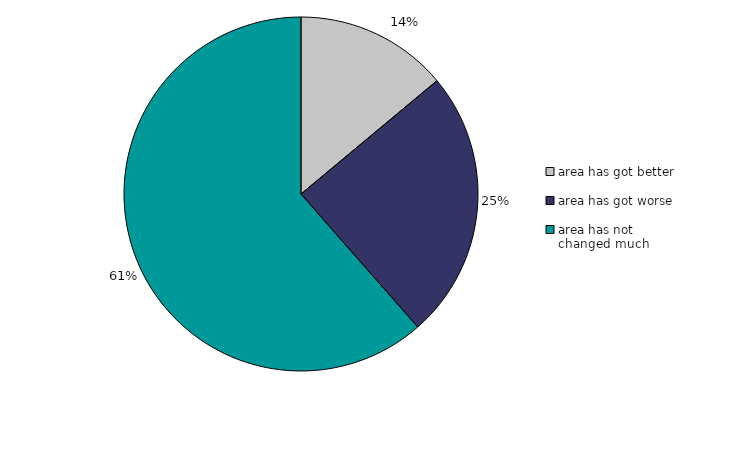
| Category | Series 0 |
|---|---|
| area has got better | 13.943 |
| area has got worse | 24.59 |
| area has not changed much | 61.467 |